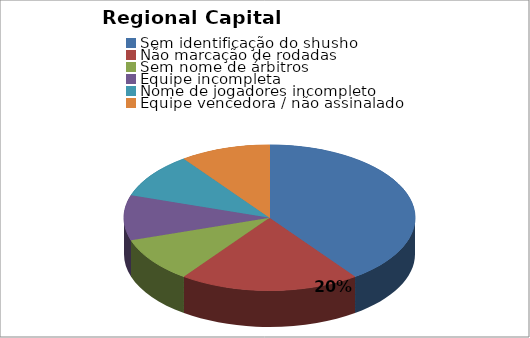
| Category | Series 1 | Series 0 |
|---|---|---|
| Sem identificação do shusho | 4 | 0.4 |
| Não marcação de rodadas | 2 | 0.2 |
| Sem nome de árbitros | 1 | 0.1 |
| Equipe incompleta | 1 | 0.1 |
| Nome de jogadores incompleto | 1 | 0.1 |
| Equipe vencedora / não assinalado | 1 | 0.1 |